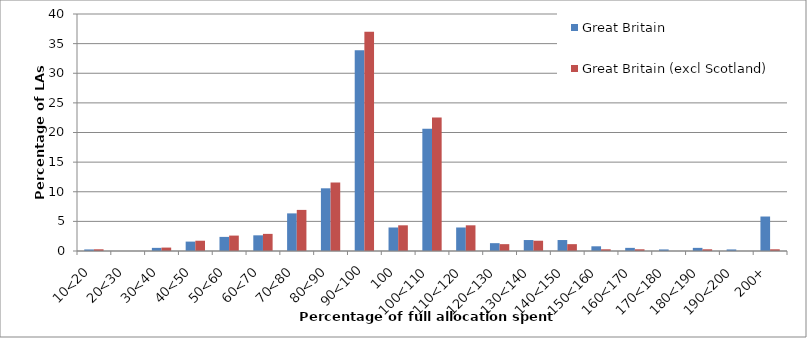
| Category | Great Britain | Great Britain (excl Scotland) |
|---|---|---|
| 10<20 | 0.265 | 0.289 |
| 20<30 | 0 | 0 |
| 30<40 | 0.529 | 0.578 |
| 40<50 | 1.587 | 1.734 |
| 50<60 | 2.381 | 2.601 |
| 60<70 | 2.646 | 2.89 |
| 70<80 | 6.349 | 6.936 |
| 80<90 | 10.582 | 11.561 |
| 90<100 | 33.862 | 36.994 |
| 100 | 3.968 | 4.335 |
| 100<110 | 20.635 | 22.543 |
| 110<120 | 3.968 | 4.335 |
| 120<130 | 1.323 | 1.156 |
| 130<140 | 1.852 | 1.734 |
| 140<150 | 1.852 | 1.156 |
| 150<160 | 0.794 | 0.289 |
| 160<170 | 0.529 | 0.289 |
| 170<180 | 0.265 | 0 |
| 180<190 | 0.529 | 0.289 |
| 190<200 | 0.265 | 0 |
| 200+ | 5.82 | 0.289 |